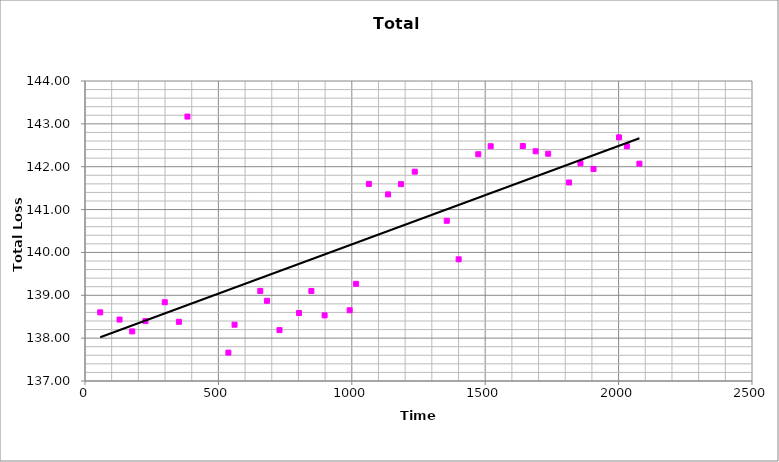
| Category | Series 1 |
|---|---|
| 57.0 | 138.602 |
| 129.5 | 138.434 |
| 177.0 | 138.157 |
| 226.5 | 138.398 |
| 299.0 | 138.838 |
| 352.0 | 138.381 |
| 384.0 | 143.17 |
| 537.5 | 137.662 |
| 560.5 | 138.314 |
| 657.0 | 139.101 |
| 682.0 | 138.871 |
| 729.0 | 138.187 |
| 802.0 | 138.586 |
| 848.5 | 139.101 |
| 898.0 | 138.532 |
| 992.0 | 138.651 |
| 1016.0 | 139.268 |
| 1064.0 | 141.598 |
| 1136.0 | 141.354 |
| 1184.5 | 141.593 |
| 1236.0 | 141.885 |
| 1356.0 | 140.739 |
| 1400.5 | 139.84 |
| 1474.0 | 142.292 |
| 1520.5 | 142.478 |
| 1641.0 | 142.482 |
| 1689.0 | 142.36 |
| 1736.0 | 142.303 |
| 1814.0 | 141.632 |
| 1857.0 | 142.078 |
| 1906.0 | 141.947 |
| 2001.5 | 142.685 |
| 2031.0 | 142.478 |
| 2078.0 | 142.071 |